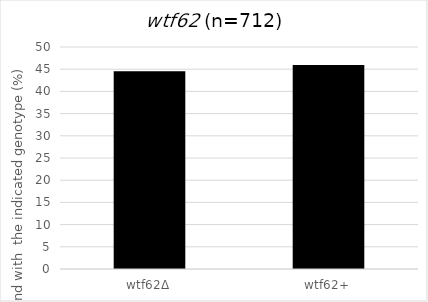
| Category | spores that are viable and with the indicated genotype |
|---|---|
| wtf62Δ | 44.522 |
| wtf62+ | 45.927 |